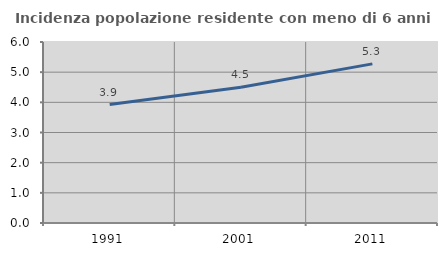
| Category | Incidenza popolazione residente con meno di 6 anni |
|---|---|
| 1991.0 | 3.925 |
| 2001.0 | 4.498 |
| 2011.0 | 5.275 |